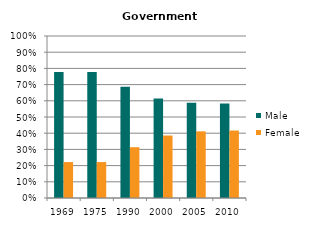
| Category | Male | Female |
|---|---|---|
| 1969.0 | 0.778 | 0.222 |
| 1975.0 | 0.778 | 0.222 |
| 1990.0 | 0.686 | 0.314 |
| 2000.0 | 0.614 | 0.386 |
| 2005.0 | 0.589 | 0.411 |
| 2010.0 | 0.584 | 0.416 |